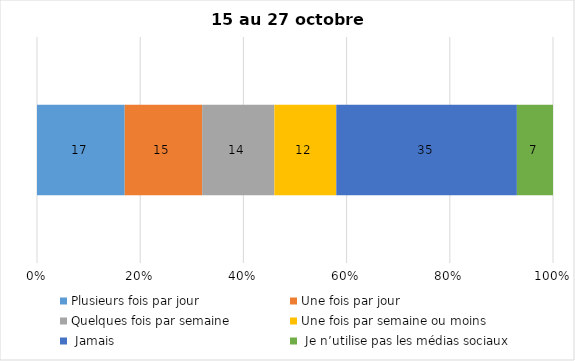
| Category | Plusieurs fois par jour | Une fois par jour | Quelques fois par semaine   | Une fois par semaine ou moins   |  Jamais   |  Je n’utilise pas les médias sociaux |
|---|---|---|---|---|---|---|
| 0 | 17 | 15 | 14 | 12 | 35 | 7 |